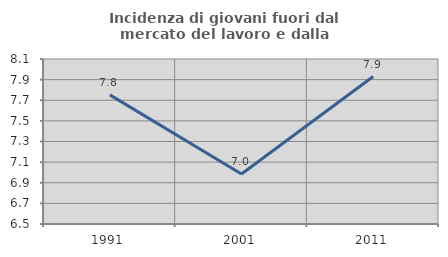
| Category | Incidenza di giovani fuori dal mercato del lavoro e dalla formazione  |
|---|---|
| 1991.0 | 7.752 |
| 2001.0 | 6.984 |
| 2011.0 | 7.93 |